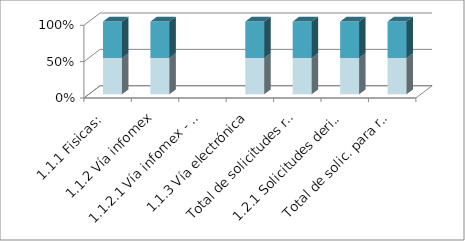
| Category | Series 3 | Series 4 | Series 5 | Series 0 | Series 1 | Series 2 |
|---|---|---|---|---|---|---|
| 1.1.1 Fisicas: |  |  | 2 |  |  | 2 |
| 1.1.2 Vía infomex |  |  | 28 |  |  | 28 |
| 1.1.2.1 Vía infomex - PNT |  |  | 0 |  |  | 0 |
| 1.1.3 Vía electrónica |  |  | 17 |  |  | 17 |
| Total de solicitudes recibidas: |  |  | 47 |  |  | 47 |
| 1.2.1 Solicitudes derivadas por incom |  |  | 2 |  |  | 2 |
| Total de solic. para resolución: |  |  | 45 |  |  | 45 |